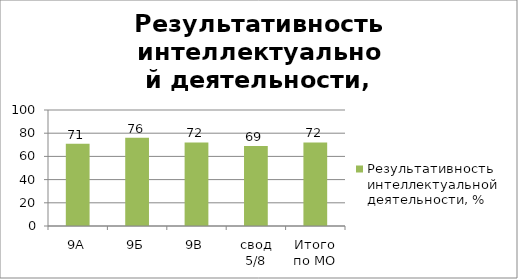
| Category | Результативность интеллектуальной деятельности, % |
|---|---|
| 9А | 71 |
| 9Б | 76 |
| 9В | 72 |
| свод 5/8 | 69 |
| Итого по МО | 72 |